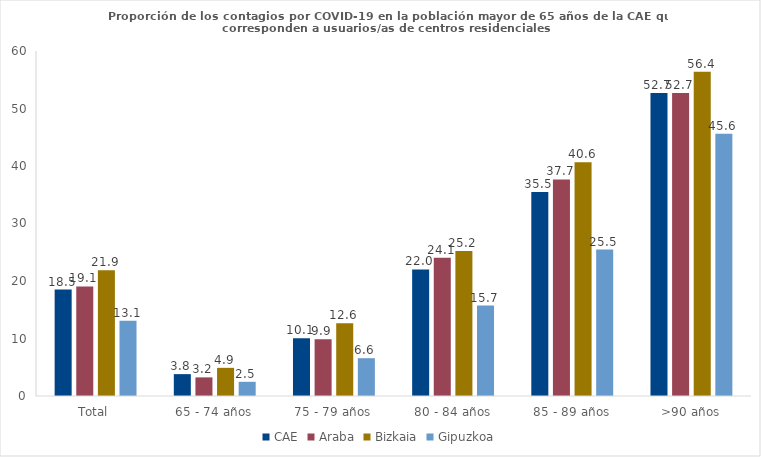
| Category | CAE | Araba | Bizkaia | Gipuzkoa |
|---|---|---|---|---|
| Total | 18.518 | 19.051 | 21.85 | 13.107 |
| 65 - 74 años | 3.805 | 3.238 | 4.897 | 2.469 |
| 75 - 79 años | 10.061 | 9.858 | 12.646 | 6.572 |
| 80 - 84 años | 22.013 | 24.052 | 25.202 | 15.718 |
| 85 - 89 años | 35.47 | 37.665 | 40.632 | 25.467 |
| >90 años | 52.698 | 52.715 | 56.405 | 45.6 |